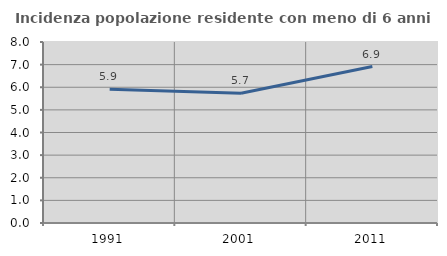
| Category | Incidenza popolazione residente con meno di 6 anni |
|---|---|
| 1991.0 | 5.914 |
| 2001.0 | 5.734 |
| 2011.0 | 6.916 |